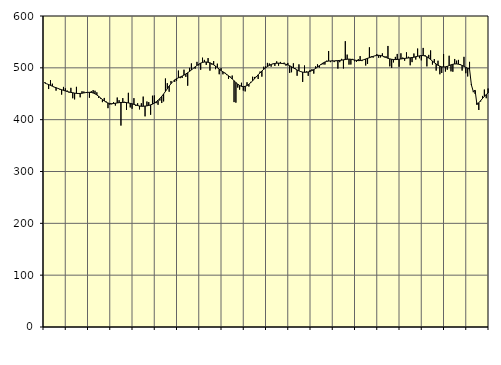
| Category | Piggar | Series 1 |
|---|---|---|
| nan | 472.5 | 470.45 |
| 1.0 | 469.1 | 469.13 |
| 1.0 | 459.1 | 467.78 |
| 1.0 | 476.2 | 466.17 |
| 1.0 | 469.4 | 464.6 |
| 1.0 | 462.6 | 463.02 |
| 1.0 | 456 | 461.69 |
| 1.0 | 460.1 | 460.31 |
| 1.0 | 458.1 | 458.98 |
| 1.0 | 448.4 | 457.76 |
| 1.0 | 463.2 | 456.57 |
| 1.0 | 460.4 | 455.44 |
| nan | 456.2 | 454.37 |
| 2.0 | 452.2 | 453.43 |
| 2.0 | 461.4 | 452.63 |
| 2.0 | 441.3 | 451.92 |
| 2.0 | 439.1 | 451.25 |
| 2.0 | 463.3 | 450.72 |
| 2.0 | 451.5 | 450.47 |
| 2.0 | 443.1 | 450.57 |
| 2.0 | 454.8 | 451.01 |
| 2.0 | 454.3 | 451.64 |
| 2.0 | 452.7 | 452.27 |
| 2.0 | 452 | 452.71 |
| nan | 442.3 | 452.8 |
| 3.0 | 455 | 452.42 |
| 3.0 | 457 | 451.44 |
| 3.0 | 455.8 | 449.85 |
| 3.0 | 452.8 | 447.69 |
| 3.0 | 441.9 | 445 |
| 3.0 | 440.6 | 441.99 |
| 3.0 | 433.8 | 438.95 |
| 3.0 | 441.9 | 436.15 |
| 3.0 | 435.1 | 433.85 |
| 3.0 | 422.2 | 432.13 |
| 3.0 | 428.8 | 431.12 |
| nan | 429.6 | 430.85 |
| 4.0 | 433.7 | 431.13 |
| 4.0 | 427.2 | 431.68 |
| 4.0 | 442.7 | 432.28 |
| 4.0 | 437.6 | 432.82 |
| 4.0 | 388.6 | 433.18 |
| 4.0 | 441.6 | 433.3 |
| 4.0 | 434.5 | 433.23 |
| 4.0 | 418.7 | 432.89 |
| 4.0 | 451.8 | 432.26 |
| 4.0 | 423.6 | 431.5 |
| 4.0 | 421 | 430.61 |
| nan | 441.5 | 429.52 |
| 5.0 | 426.5 | 428.33 |
| 5.0 | 431.7 | 427.23 |
| 5.0 | 419.8 | 426.36 |
| 5.0 | 431.7 | 425.85 |
| 5.0 | 444.5 | 425.85 |
| 5.0 | 406.4 | 426.19 |
| 5.0 | 435 | 426.69 |
| 5.0 | 433.9 | 427.47 |
| 5.0 | 409.5 | 428.54 |
| 5.0 | 446.2 | 429.95 |
| 5.0 | 446.8 | 431.89 |
| nan | 431.8 | 434.4 |
| 6.0 | 428.7 | 437.39 |
| 6.0 | 436.8 | 440.93 |
| 6.0 | 432.1 | 445.02 |
| 6.0 | 435.2 | 449.57 |
| 6.0 | 479.4 | 454.45 |
| 6.0 | 470.4 | 459.63 |
| 6.0 | 453.9 | 464.81 |
| 6.0 | 474.6 | 469.52 |
| 6.0 | 473.5 | 473.53 |
| 6.0 | 472.9 | 476.75 |
| 6.0 | 474.7 | 479.1 |
| nan | 494.7 | 480.85 |
| 7.0 | 480.1 | 482.45 |
| 7.0 | 480.4 | 484.12 |
| 7.0 | 496.4 | 485.99 |
| 7.0 | 482.5 | 488.17 |
| 7.0 | 465.5 | 490.57 |
| 7.0 | 500 | 493.12 |
| 7.0 | 508.5 | 495.91 |
| 7.0 | 498.7 | 498.87 |
| 7.0 | 498.3 | 501.83 |
| 7.0 | 511.5 | 504.62 |
| 7.0 | 504.7 | 507.11 |
| nan | 496.3 | 509.1 |
| 8.0 | 519.6 | 510.45 |
| 8.0 | 515.3 | 511.18 |
| 8.0 | 505.7 | 511.25 |
| 8.0 | 518.8 | 510.73 |
| 8.0 | 494.6 | 509.67 |
| 8.0 | 506.3 | 508.06 |
| 8.0 | 513 | 505.84 |
| 8.0 | 497.4 | 503.18 |
| 8.0 | 508 | 500.34 |
| 8.0 | 487.6 | 497.55 |
| 8.0 | 499.4 | 494.84 |
| nan | 487.5 | 492.3 |
| 9.0 | 490.8 | 489.89 |
| 9.0 | 486 | 487.37 |
| 9.0 | 478.7 | 484.69 |
| 9.0 | 482.9 | 481.77 |
| 9.0 | 485.1 | 478.54 |
| 9.0 | 433.9 | 475.11 |
| 9.0 | 432.8 | 471.66 |
| 9.0 | 461.9 | 468.51 |
| 9.0 | 457.9 | 465.97 |
| 9.0 | 471.2 | 464.33 |
| 9.0 | 456.1 | 463.76 |
| nan | 454.5 | 464.27 |
| 10.0 | 472.1 | 465.79 |
| 10.0 | 463.9 | 468.18 |
| 10.0 | 472.9 | 471.29 |
| 10.0 | 482.8 | 474.9 |
| 10.0 | 482.4 | 478.77 |
| 10.0 | 484 | 482.71 |
| 10.0 | 478.5 | 486.61 |
| 10.0 | 492.7 | 490.35 |
| 10.0 | 483 | 493.88 |
| 10.0 | 502.1 | 497.12 |
| 10.0 | 502.7 | 500.01 |
| nan | 509.5 | 502.57 |
| 11.0 | 508.4 | 504.71 |
| 11.0 | 502.3 | 506.44 |
| 11.0 | 507.3 | 507.71 |
| 11.0 | 503.7 | 508.51 |
| 11.0 | 512.5 | 508.92 |
| 11.0 | 504.2 | 509 |
| 11.0 | 511.4 | 508.8 |
| 11.0 | 509.2 | 508.47 |
| 11.0 | 510 | 507.88 |
| 11.0 | 504.2 | 506.97 |
| 11.0 | 509.5 | 505.68 |
| nan | 490.2 | 504.02 |
| 12.0 | 491.5 | 502.05 |
| 12.0 | 508.7 | 499.95 |
| 12.0 | 499.1 | 497.85 |
| 12.0 | 484.7 | 495.84 |
| 12.0 | 506.7 | 494.08 |
| 12.0 | 493 | 492.68 |
| 12.0 | 472.8 | 491.76 |
| 12.0 | 504.5 | 491.38 |
| 12.0 | 493.2 | 491.55 |
| 12.0 | 484.5 | 492.16 |
| 12.0 | 495.7 | 493.2 |
| nan | 497.3 | 494.67 |
| 13.0 | 488.8 | 496.58 |
| 13.0 | 502.9 | 498.87 |
| 13.0 | 506.8 | 501.46 |
| 13.0 | 500.5 | 504.22 |
| 13.0 | 505.7 | 506.92 |
| 13.0 | 506.5 | 509.36 |
| 13.0 | 506.3 | 511.26 |
| 13.0 | 513.9 | 512.46 |
| 13.0 | 532.5 | 513.02 |
| 13.0 | 511 | 513.23 |
| 13.0 | 514.2 | 513.29 |
| nan | 511.1 | 513.34 |
| 14.0 | 514.4 | 513.52 |
| 14.0 | 498.5 | 513.86 |
| 14.0 | 510.9 | 514.29 |
| 14.0 | 517.3 | 514.81 |
| 14.0 | 498.7 | 515.4 |
| 14.0 | 551.4 | 516.03 |
| 14.0 | 525.5 | 516.59 |
| 14.0 | 506.2 | 516.81 |
| 14.0 | 506.4 | 516.54 |
| 14.0 | 517.3 | 515.86 |
| 14.0 | 512.6 | 515.05 |
| nan | 511.6 | 514.31 |
| 15.0 | 516.9 | 513.9 |
| 15.0 | 522.6 | 514.01 |
| 15.0 | 513 | 514.67 |
| 15.0 | 515.7 | 515.76 |
| 15.0 | 504.5 | 517.1 |
| 15.0 | 507.6 | 518.39 |
| 15.0 | 539.5 | 519.53 |
| 15.0 | 522.3 | 520.75 |
| 15.0 | 519.7 | 522.07 |
| 15.0 | 523.2 | 523.23 |
| 15.0 | 526.6 | 523.95 |
| nan | 519.4 | 524.17 |
| 16.0 | 520.1 | 523.8 |
| 16.0 | 527.9 | 522.84 |
| 16.0 | 520.2 | 521.49 |
| 16.0 | 522.3 | 519.96 |
| 16.0 | 542.2 | 518.47 |
| 16.0 | 502.9 | 517.29 |
| 16.0 | 499.9 | 516.48 |
| 16.0 | 510.5 | 516 |
| 16.0 | 521.1 | 515.93 |
| 16.0 | 526.8 | 516.13 |
| 16.0 | 502.1 | 516.52 |
| nan | 528 | 517.08 |
| 17.0 | 519.9 | 517.67 |
| 17.0 | 513.7 | 518.17 |
| 17.0 | 529.9 | 518.63 |
| 17.0 | 521.4 | 519.06 |
| 17.0 | 504.9 | 519.41 |
| 17.0 | 511 | 519.82 |
| 17.0 | 527.6 | 520.48 |
| 17.0 | 516 | 521.39 |
| 17.0 | 537.2 | 522.31 |
| 17.0 | 518.5 | 523.11 |
| 17.0 | 514.4 | 523.66 |
| nan | 538.4 | 523.64 |
| 18.0 | 524.6 | 522.83 |
| 18.0 | 502.8 | 521.26 |
| 18.0 | 525 | 518.91 |
| 18.0 | 533.6 | 516.02 |
| 18.0 | 506.3 | 513 |
| 18.0 | 516.9 | 510.08 |
| 18.0 | 494.7 | 507.37 |
| 18.0 | 513.7 | 504.98 |
| 18.0 | 487.6 | 503.11 |
| 18.0 | 490.1 | 501.95 |
| 18.0 | 526.7 | 501.55 |
| nan | 492.8 | 501.89 |
| 19.0 | 496.4 | 502.87 |
| 19.0 | 523.3 | 504.27 |
| 19.0 | 493.2 | 505.74 |
| 19.0 | 492.5 | 506.87 |
| 19.0 | 517.1 | 507.5 |
| 19.0 | 513.8 | 507.58 |
| 19.0 | 515.3 | 507.09 |
| 19.0 | 507.2 | 506.11 |
| 19.0 | 494.7 | 504.65 |
| 19.0 | 521.2 | 502.84 |
| 19.0 | 489.6 | 500.87 |
| nan | 483.4 | 498.99 |
| 20.0 | 511.5 | 497.66 |
| 20.0 | 468.7 | 467.18 |
| 20.0 | 453 | 454.69 |
| 20.0 | 449.7 | 456.55 |
| 20.0 | 432.7 | 429.07 |
| 20.0 | 418.7 | 432.7 |
| 20.0 | 435.1 | 436.75 |
| 20.0 | 445.8 | 440.91 |
| 20.0 | 458.1 | 444.93 |
| 20.0 | 441.4 | 448.54 |
| 20.0 | 460.1 | 451.53 |